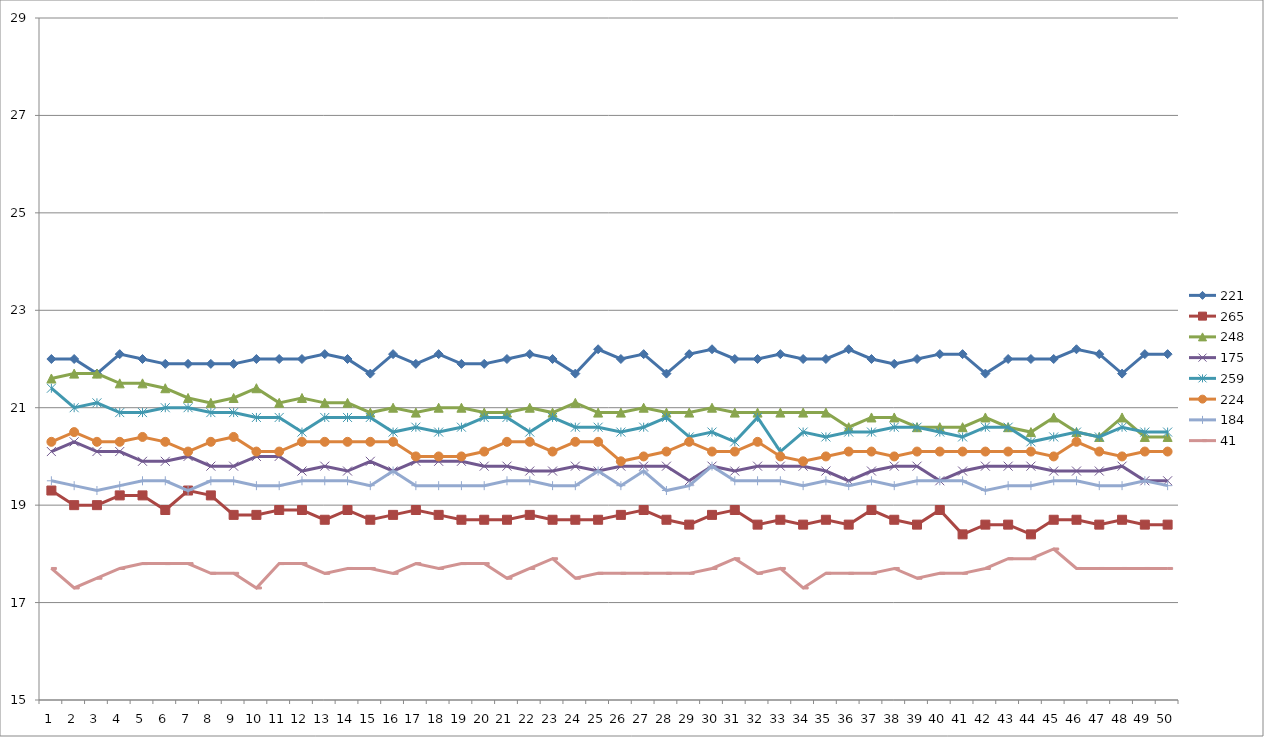
| Category | 221 | 265 | 248 | 175 | 259 | 224 | 184 | 41 |
|---|---|---|---|---|---|---|---|---|
| 0 | 22 | 19.3 | 21.6 | 20.1 | 21.4 | 20.3 | 19.5 | 17.7 |
| 1 | 22 | 19 | 21.7 | 20.3 | 21 | 20.5 | 19.4 | 17.3 |
| 2 | 21.7 | 19 | 21.7 | 20.1 | 21.1 | 20.3 | 19.3 | 17.5 |
| 3 | 22.1 | 19.2 | 21.5 | 20.1 | 20.9 | 20.3 | 19.4 | 17.7 |
| 4 | 22 | 19.2 | 21.5 | 19.9 | 20.9 | 20.4 | 19.5 | 17.8 |
| 5 | 21.9 | 18.9 | 21.4 | 19.9 | 21 | 20.3 | 19.5 | 17.8 |
| 6 | 21.9 | 19.3 | 21.2 | 20 | 21 | 20.1 | 19.3 | 17.8 |
| 7 | 21.9 | 19.2 | 21.1 | 19.8 | 20.9 | 20.3 | 19.5 | 17.6 |
| 8 | 21.9 | 18.8 | 21.2 | 19.8 | 20.9 | 20.4 | 19.5 | 17.6 |
| 9 | 22 | 18.8 | 21.4 | 20 | 20.8 | 20.1 | 19.4 | 17.3 |
| 10 | 22 | 18.9 | 21.1 | 20 | 20.8 | 20.1 | 19.4 | 17.8 |
| 11 | 22 | 18.9 | 21.2 | 19.7 | 20.5 | 20.3 | 19.5 | 17.8 |
| 12 | 22.1 | 18.7 | 21.1 | 19.8 | 20.8 | 20.3 | 19.5 | 17.6 |
| 13 | 22 | 18.9 | 21.1 | 19.7 | 20.8 | 20.3 | 19.5 | 17.7 |
| 14 | 21.7 | 18.7 | 20.9 | 19.9 | 20.8 | 20.3 | 19.4 | 17.7 |
| 15 | 22.1 | 18.8 | 21 | 19.7 | 20.5 | 20.3 | 19.7 | 17.6 |
| 16 | 21.9 | 18.9 | 20.9 | 19.9 | 20.6 | 20 | 19.4 | 17.8 |
| 17 | 22.1 | 18.8 | 21 | 19.9 | 20.5 | 20 | 19.4 | 17.7 |
| 18 | 21.9 | 18.7 | 21 | 19.9 | 20.6 | 20 | 19.4 | 17.8 |
| 19 | 21.9 | 18.7 | 20.9 | 19.8 | 20.8 | 20.1 | 19.4 | 17.8 |
| 20 | 22 | 18.7 | 20.9 | 19.8 | 20.8 | 20.3 | 19.5 | 17.5 |
| 21 | 22.1 | 18.8 | 21 | 19.7 | 20.5 | 20.3 | 19.5 | 17.7 |
| 22 | 22 | 18.7 | 20.9 | 19.7 | 20.8 | 20.1 | 19.4 | 17.9 |
| 23 | 21.7 | 18.7 | 21.1 | 19.8 | 20.6 | 20.3 | 19.4 | 17.5 |
| 24 | 22.2 | 18.7 | 20.9 | 19.7 | 20.6 | 20.3 | 19.7 | 17.6 |
| 25 | 22 | 18.8 | 20.9 | 19.8 | 20.5 | 19.9 | 19.4 | 17.6 |
| 26 | 22.1 | 18.9 | 21 | 19.8 | 20.6 | 20 | 19.7 | 17.6 |
| 27 | 21.7 | 18.7 | 20.9 | 19.8 | 20.8 | 20.1 | 19.3 | 17.6 |
| 28 | 22.1 | 18.6 | 20.9 | 19.5 | 20.4 | 20.3 | 19.4 | 17.6 |
| 29 | 22.2 | 18.8 | 21 | 19.8 | 20.5 | 20.1 | 19.8 | 17.7 |
| 30 | 22 | 18.9 | 20.9 | 19.7 | 20.3 | 20.1 | 19.5 | 17.9 |
| 31 | 22 | 18.6 | 20.9 | 19.8 | 20.8 | 20.3 | 19.5 | 17.6 |
| 32 | 22.1 | 18.7 | 20.9 | 19.8 | 20.1 | 20 | 19.5 | 17.7 |
| 33 | 22 | 18.6 | 20.9 | 19.8 | 20.5 | 19.9 | 19.4 | 17.3 |
| 34 | 22 | 18.7 | 20.9 | 19.7 | 20.4 | 20 | 19.5 | 17.6 |
| 35 | 22.2 | 18.6 | 20.6 | 19.5 | 20.5 | 20.1 | 19.4 | 17.6 |
| 36 | 22 | 18.9 | 20.8 | 19.7 | 20.5 | 20.1 | 19.5 | 17.6 |
| 37 | 21.9 | 18.7 | 20.8 | 19.8 | 20.6 | 20 | 19.4 | 17.7 |
| 38 | 22 | 18.6 | 20.6 | 19.8 | 20.6 | 20.1 | 19.5 | 17.5 |
| 39 | 22.1 | 18.9 | 20.6 | 19.5 | 20.5 | 20.1 | 19.5 | 17.6 |
| 40 | 22.1 | 18.4 | 20.6 | 19.7 | 20.4 | 20.1 | 19.5 | 17.6 |
| 41 | 21.7 | 18.6 | 20.8 | 19.8 | 20.6 | 20.1 | 19.3 | 17.7 |
| 42 | 22 | 18.6 | 20.6 | 19.8 | 20.6 | 20.1 | 19.4 | 17.9 |
| 43 | 22 | 18.4 | 20.5 | 19.8 | 20.3 | 20.1 | 19.4 | 17.9 |
| 44 | 22 | 18.7 | 20.8 | 19.7 | 20.4 | 20 | 19.5 | 18.1 |
| 45 | 22.2 | 18.7 | 20.5 | 19.7 | 20.5 | 20.3 | 19.5 | 17.7 |
| 46 | 22.1 | 18.6 | 20.4 | 19.7 | 20.4 | 20.1 | 19.4 | 17.7 |
| 47 | 21.7 | 18.7 | 20.8 | 19.8 | 20.6 | 20 | 19.4 | 17.7 |
| 48 | 22.1 | 18.6 | 20.4 | 19.5 | 20.5 | 20.1 | 19.5 | 17.7 |
| 49 | 22.1 | 18.6 | 20.4 | 19.5 | 20.5 | 20.1 | 19.4 | 17.7 |